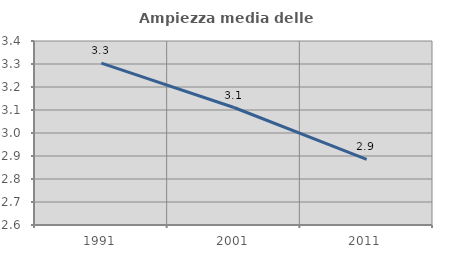
| Category | Ampiezza media delle famiglie |
|---|---|
| 1991.0 | 3.304 |
| 2001.0 | 3.111 |
| 2011.0 | 2.885 |